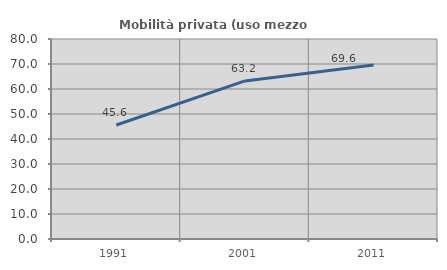
| Category | Mobilità privata (uso mezzo privato) |
|---|---|
| 1991.0 | 45.616 |
| 2001.0 | 63.242 |
| 2011.0 | 69.585 |